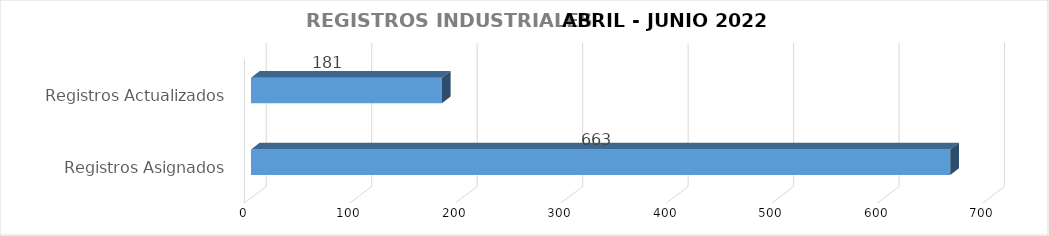
| Category | Series 0 |
|---|---|
| Registros Asignados | 663 |
| Registros Actualizados | 181 |